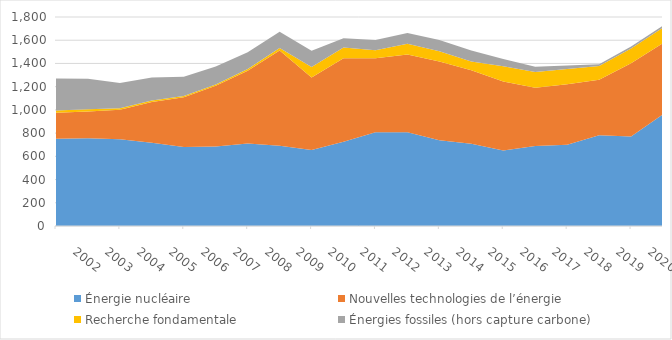
| Category | Énergie nucléaire | Nouvelles technologies de l’énergie | Recherche fondamentale | Énergies fossiles (hors capture carbone) |
|---|---|---|---|---|
| 2002.0 | 751.608 | 223.619 | 18.643 | 275.518 |
| 2003.0 | 754.818 | 230.468 | 20.964 | 261.647 |
| 2004.0 | 746.691 | 254.362 | 13.638 | 216.891 |
| 2005.0 | 718.05 | 350.191 | 11.883 | 198.521 |
| 2006.0 | 680.647 | 428.555 | 9.818 | 167.013 |
| 2007.0 | 685.127 | 521.801 | 11.484 | 154.99 |
| 2008.0 | 711.53 | 625.218 | 14.515 | 145.705 |
| 2009.0 | 690.824 | 819.931 | 21.443 | 139.763 |
| 2010.0 | 654.882 | 624.184 | 90.033 | 139.287 |
| 2011.0 | 726.224 | 717.861 | 93.083 | 79.192 |
| 2012.0 | 807.1 | 638.484 | 68.944 | 87.957 |
| 2013.0 | 806.584 | 671.046 | 91.298 | 93.789 |
| 2014.0 | 737.828 | 678.106 | 89.033 | 97.031 |
| 2015.0 | 707.779 | 632.851 | 75.752 | 95.558 |
| 2016.0 | 649.582 | 594.323 | 132.055 | 62.822 |
| 2017.0 | 689.545 | 500.877 | 136.228 | 43.956 |
| 2018.0 | 699.307 | 522.276 | 129.941 | 29.702 |
| 2019.0 | 780.94 | 478.918 | 118.075 | 15.075 |
| 2020.0 | 771.023 | 629.702 | 127.407 | 16.816 |
| 2021.0 | 961.579 | 614.184 | 133.293 | 16.197 |